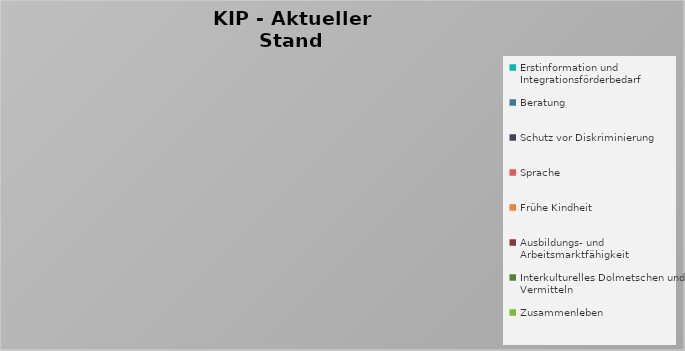
| Category | Total |
|---|---|
| Erstinformation und Integrationsförderbedarf | 0 |
| Beratung | 0 |
| Schutz vor Diskriminierung | 0 |
| Sprache | 0 |
| Frühe Kindheit | 0 |
| Ausbildungs- und Arbeitsmarktfähigkeit | 0 |
| Interkulturelles Dolmetschen und Vermitteln | 0 |
| Zusammenleben | 0 |